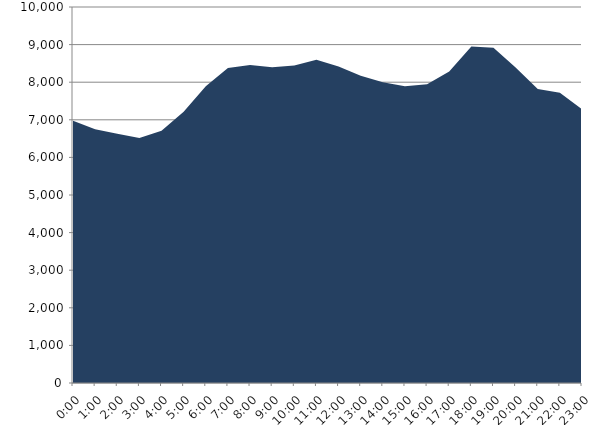
| Category | Series 0 | Series 1 |
|---|---|---|
| 2020-03-18 |  | 6976.452 |
| 2020-03-18 01:00:00 |  | 6745.875 |
| 2020-03-18 02:00:00 |  | 6629.897 |
| 2020-03-18 03:00:00 |  | 6518.513 |
| 2020-03-18 04:00:00 |  | 6709.012 |
| 2020-03-18 05:00:00 |  | 7211.507 |
| 2020-03-18 06:00:00 |  | 7891.357 |
| 2020-03-18 07:00:00 |  | 8378.15 |
| 2020-03-18 08:00:00 |  | 8457.944 |
| 2020-03-18 09:00:00 |  | 8398.271 |
| 2020-03-18 10:00:00 |  | 8441.749 |
| 2020-03-18 11:00:00 |  | 8595.433 |
| 2020-03-18 12:00:00 |  | 8416.524 |
| 2020-03-18 13:00:00 |  | 8169.778 |
| 2020-03-18 14:00:00 |  | 8000.913 |
| 2020-03-18 15:00:00 |  | 7891.82 |
| 2020-03-18 16:00:00 |  | 7945.33 |
| 2020-03-18 17:00:00 |  | 8286.99 |
| 2020-03-18 18:00:00 |  | 8947.295 |
| 2020-03-18 19:00:00 |  | 8916.582 |
| 2020-03-18 20:00:00 |  | 8393.518 |
| 2020-03-18 21:00:00 |  | 7818.839 |
| 2020-03-18 22:00:00 |  | 7721.007 |
| 2020-03-18 23:00:00 |  | 7278.928 |